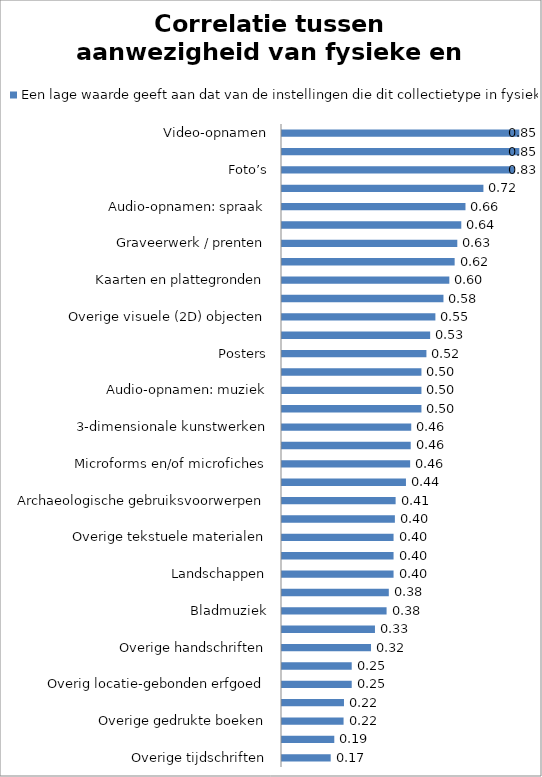
| Category | Een lage waarde geeft aan dat van de instellingen die dit collectietype in fysieke vorm beheren, er maar weinig zijn die ze ook digitale vorm beheren |
|---|---|
| Overige tijdschriften | 0.175 |
| Wetenschappelijke tijdschriften | 0.188 |
| Overige gedrukte boeken | 0.221 |
| Monumenten en andere bouwwerken | 0.222 |
| Overig locatie-gebonden erfgoed | 0.25 |
| Zeldzame (gedrukte) boeken | 0.25 |
| Overige handschriften | 0.319 |
| Archeologische sites | 0.333 |
| Bladmuziek | 0.375 |
| Overige 3-dimensionale door de mens gemaakte objecten | 0.383 |
| Landschappen | 0.4 |
| Objecten van anorganisch materiaal | 0.4 |
| Overige tekstuele materialen | 0.4 |
| Munten en penningen | 0.405 |
| Archaeologische gebruiksvoorwerpen | 0.407 |
| Planten en dieren | 0.444 |
| Microforms en/of microfiches | 0.459 |
| Overige gebruiksvoorwerpen | 0.462 |
| 3-dimensionale kunstwerken | 0.463 |
| Middeleeuwse handschriften | 0.5 |
| Audio-opnamen: muziek | 0.5 |
| Kranten | 0.5 |
| Posters | 0.518 |
| Schilderijen | 0.531 |
| Overige visuele (2D) objecten | 0.55 |
| Tekeningen | 0.579 |
| Kaarten en plattegronden | 0.6 |
| Archieven: Overige archivalia | 0.619 |
| Graveerwerk / prenten | 0.629 |
| Overig time-based | 0.643 |
| Audio-opnamen: spraak | 0.658 |
| Archieven: Overheidsdocumenten | 0.722 |
| Foto’s | 0.833 |
| Film | 0.851 |
| Video-opnamen | 0.851 |